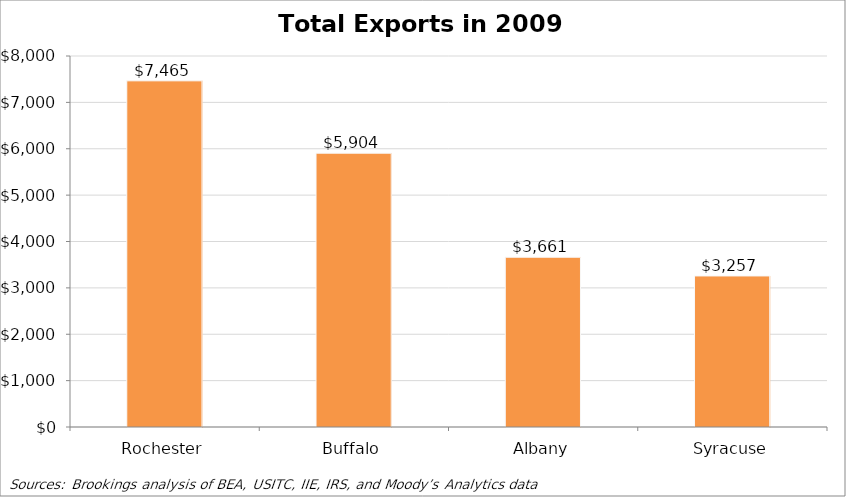
| Category | Total exports, 2009, (millions) |
|---|---|
| Rochester | 7464.523 |
| Buffalo | 5904.124 |
| Albany | 3660.989 |
| Syracuse | 3257.399 |